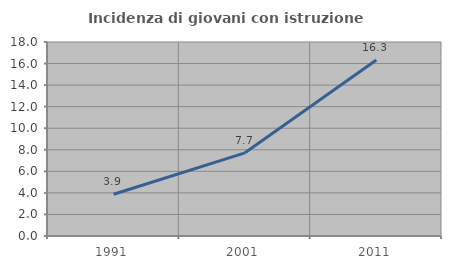
| Category | Incidenza di giovani con istruzione universitaria |
|---|---|
| 1991.0 | 3.874 |
| 2001.0 | 7.716 |
| 2011.0 | 16.321 |